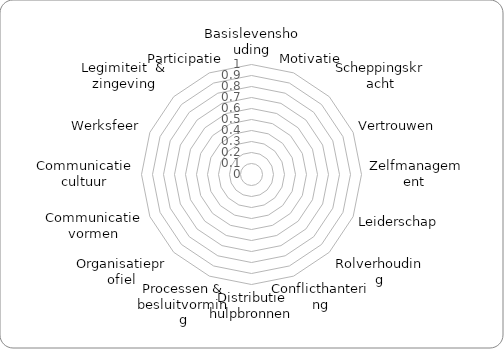
| Category | Meme |
|---|---|
| Basislevenshouding | 0 |
| Motivatie | 0 |
| Scheppingskracht | 0 |
| Vertrouwen | 0 |
| Zelfmanagement  | 0 |
| Leiderschap | 0 |
| Rolverhouding | 0 |
| Conflicthantering | 0 |
| Distributie hulpbronnen | 0 |
| Processen & besluitvorming | 0 |
| Organisatieprofiel | 0 |
| Communicatie vormen | 0 |
| Communicatie cultuur | 0 |
| Werksfeer | 0 |
| Legimiteit  & zingeving | 0 |
| Participatie | 0 |